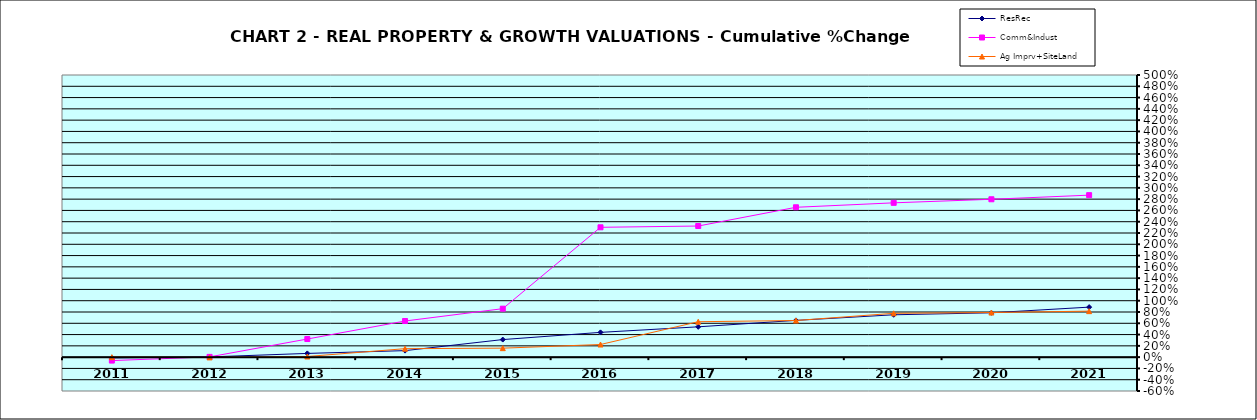
| Category | ResRec | Comm&Indust | Ag Imprv+SiteLand |
|---|---|---|---|
| 2011.0 | -0.014 | -0.061 | 0 |
| 2012.0 | 0.004 | 0.005 | -0.005 |
| 2013.0 | 0.066 | 0.321 | 0.012 |
| 2014.0 | 0.115 | 0.641 | 0.15 |
| 2015.0 | 0.311 | 0.859 | 0.159 |
| 2016.0 | 0.439 | 2.301 | 0.224 |
| 2017.0 | 0.537 | 2.324 | 0.628 |
| 2018.0 | 0.651 | 2.656 | 0.649 |
| 2019.0 | 0.751 | 2.735 | 0.777 |
| 2020.0 | 0.786 | 2.798 | 0.791 |
| 2021.0 | 0.886 | 2.871 | 0.815 |